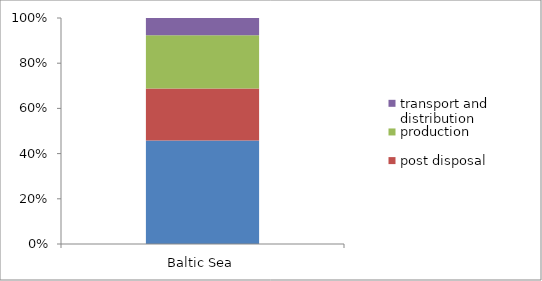
| Category | consumption | post disposal | production | transport and distribution |
|---|---|---|---|---|
| Baltic Sea | 0.458 | 0.23 | 0.236 | 0.076 |